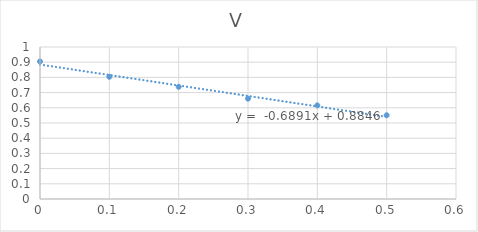
| Category | V |
|---|---|
| 0.5 | 0.551 |
| 0.4 | 0.616 |
| 0.3 | 0.66 |
| 0.2 | 0.738 |
| 0.1 | 0.804 |
| 0.0 | 0.905 |